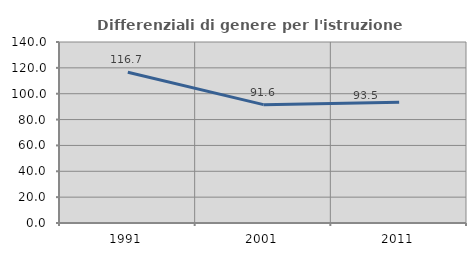
| Category | Differenziali di genere per l'istruzione superiore |
|---|---|
| 1991.0 | 116.652 |
| 2001.0 | 91.555 |
| 2011.0 | 93.49 |